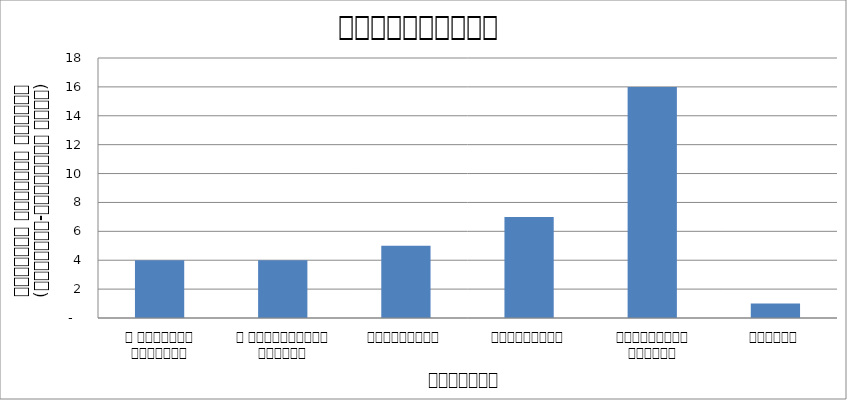
| Category | अर्थतन्त्र |
|---|---|
| द हिमालयन टाइम्स् | 4 |
| द काठमाण्डौं पोस्ट् | 4 |
| रिपब्लिका | 5 |
| कान्तिपुर | 7 |
| अन्नपूर्ण पोस्ट् | 16 |
| नागरिक | 1 |